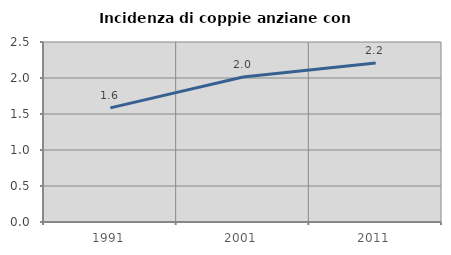
| Category | Incidenza di coppie anziane con figli |
|---|---|
| 1991.0 | 1.585 |
| 2001.0 | 2.014 |
| 2011.0 | 2.207 |